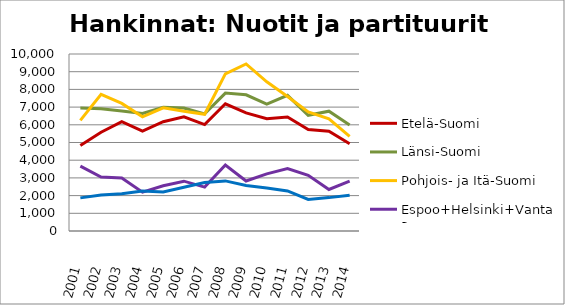
| Category | Etelä-Suomi | Länsi-Suomi | Pohjois- ja Itä-Suomi | Espoo+Helsinki+Vantaa | Muu Uusimaa |
|---|---|---|---|---|---|
| 2001.0 | 4830 | 6947 | 6251 | 3664 | 1872 |
| 2002.0 | 5580 | 6908 | 7719 | 3046 | 2032 |
| 2003.0 | 6182 | 6782 | 7208 | 2991 | 2100 |
| 2004.0 | 5643 | 6646 | 6449 | 2195 | 2265 |
| 2005.0 | 6172 | 6991 | 6958 | 2559 | 2201 |
| 2006.0 | 6451 | 6951 | 6760 | 2815 | 2467 |
| 2007.0 | 6010 | 6618 | 6594 | 2478 | 2734 |
| 2008.0 | 7188 | 7792 | 8874 | 3729 | 2830 |
| 2009.0 | 6671 | 7693 | 9437 | 2826 | 2568 |
| 2010.0 | 6346 | 7165 | 8427 | 3227 | 2428 |
| 2011.0 | 6441 | 7666 | 7603 | 3530 | 2261 |
| 2012.0 | 5735 | 6536 | 6725 | 3145 | 1782 |
| 2013.0 | 5640 | 6769 | 6334 | 2345 | 1886 |
| 2014.0 | 4929 | 5987 | 5344 | 2812 | 2026 |